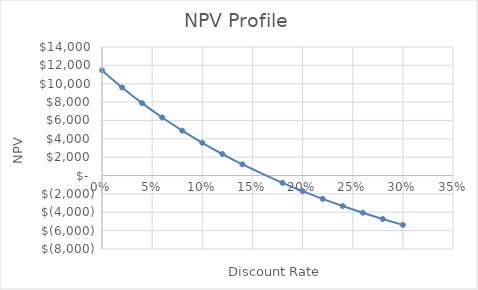
| Category | Series 0 |
|---|---|
| 0.0 | 11460 |
| 0.02 | 9593.842 |
| 0.04 | 7887.675 |
| 0.06 | 6324.065 |
| 0.08 | 4887.827 |
| 0.1 | 3565.687 |
| 0.12 | 2346.012 |
| 0.14 | 1218.578 |
| 0.18 | -794.562 |
| 0.2 | -1695.28 |
| 0.22 | -2534.043 |
| 0.24 | -3316.423 |
| 0.26 | -4047.392 |
| 0.28 | -4731.393 |
| 0.3 | -5372.408 |